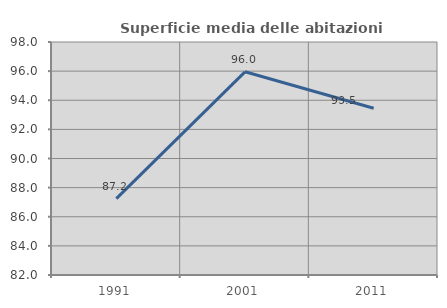
| Category | Superficie media delle abitazioni occupate |
|---|---|
| 1991.0 | 87.243 |
| 2001.0 | 95.953 |
| 2011.0 | 93.452 |